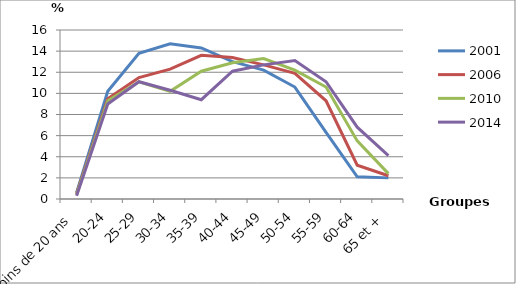
| Category | 2001 | 2006 | 2010 | 2014 |
|---|---|---|---|---|
| Moins de 20 ans | 0.6 | 0.5 | 0.4 | 0.3 |
| 20-24 | 10.2 | 9.5 | 9.3 | 9 |
| 25-29 | 13.8 | 11.5 | 11.1 | 11.1 |
| 30-34 | 14.7 | 12.3 | 10.2 | 10.3 |
| 35-39 | 14.3 | 13.6 | 12.1 | 9.4 |
| 40-44 | 13 | 13.4 | 12.9 | 12.1 |
| 45-49 | 12.2 | 12.7 | 13.3 | 12.7 |
| 50-54 | 10.6 | 11.9 | 12.2 | 13.1 |
| 55-59 | 6.3 | 9.3 | 10.6 | 11.1 |
| 60-64 | 2.1 | 3.2 | 5.5 | 6.8 |
| 65 et + | 2 | 2.2 | 2.4 | 4.1 |